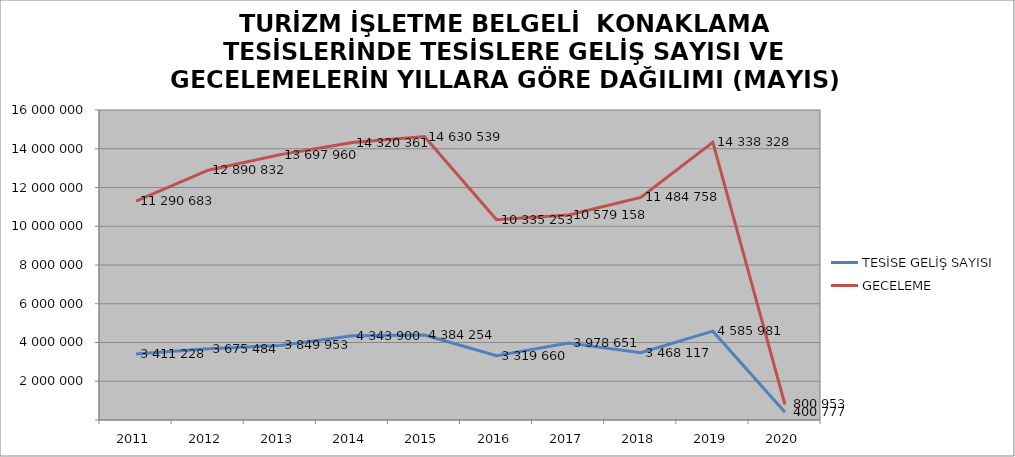
| Category | TESİSE GELİŞ SAYISI | GECELEME |
|---|---|---|
| 2011 | 3411228 | 11290683 |
| 2012 | 3675484 | 12890832 |
| 2013 | 3849953 | 13697960 |
| 2014 | 4343900 | 14320361 |
| 2015 | 4384254 | 14630539 |
| 2016 | 3319660 | 10335253 |
| 2017 | 3978651 | 10579158 |
| 2018 | 3468117 | 11484758 |
| 2019 | 4585981 | 14338328 |
| 2020 | 400777 | 800953 |